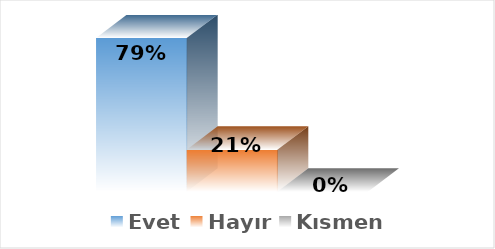
| Category | Evet | Hayır | Kısmen |
|---|---|---|---|
| 0 | 0.786 | 0.214 | 0 |